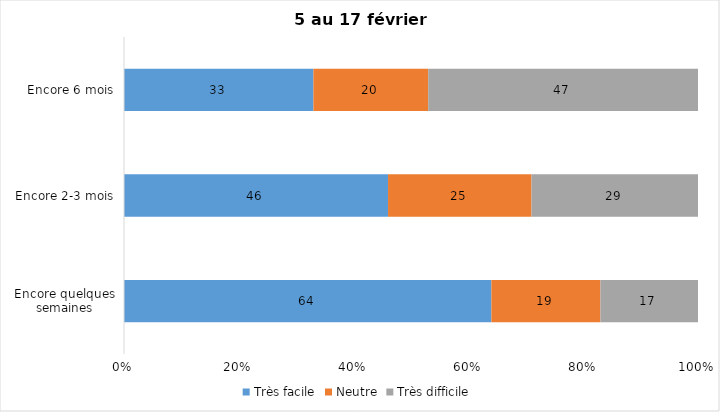
| Category | Très facile | Neutre | Très difficile |
|---|---|---|---|
| Encore quelques semaines | 64 | 19 | 17 |
| Encore 2-3 mois | 46 | 25 | 29 |
| Encore 6 mois | 33 | 20 | 47 |